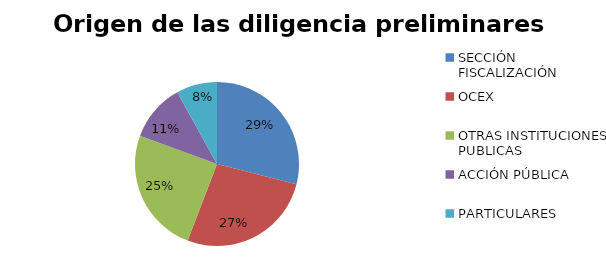
| Category | Series 0 |
|---|---|
| SECCIÓN FISCALIZACIÓN | 97 |
| OCEX | 90 |
| OTRAS INSTITUCIONES PUBLICAS | 83 |
| ACCIÓN PÚBLICA | 38 |
| PARTICULARES | 27 |